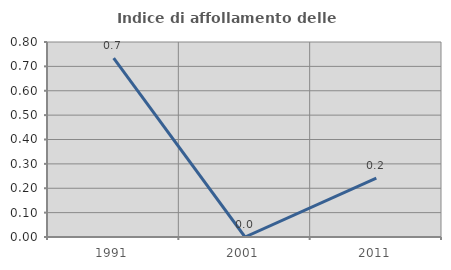
| Category | Indice di affollamento delle abitazioni  |
|---|---|
| 1991.0 | 0.733 |
| 2001.0 | 0 |
| 2011.0 | 0.242 |